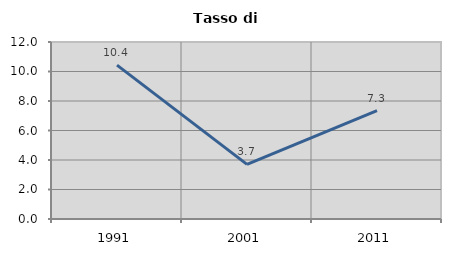
| Category | Tasso di disoccupazione   |
|---|---|
| 1991.0 | 10.429 |
| 2001.0 | 3.7 |
| 2011.0 | 7.341 |